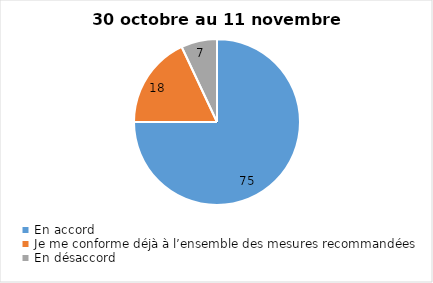
| Category | Series 0 |
|---|---|
| En accord | 75 |
| Je me conforme déjà à l’ensemble des mesures recommandées | 18 |
| En désaccord | 7 |